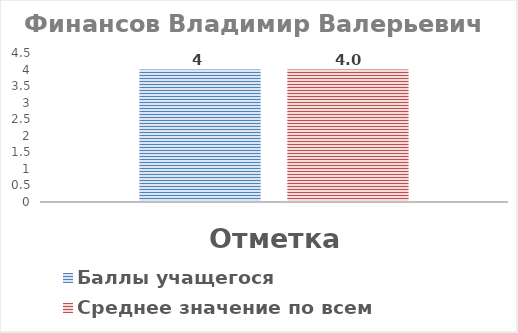
| Category | Баллы учащегося | Среднее значение по всем учащимся |
|---|---|---|
| Отметка | 4 | 4 |